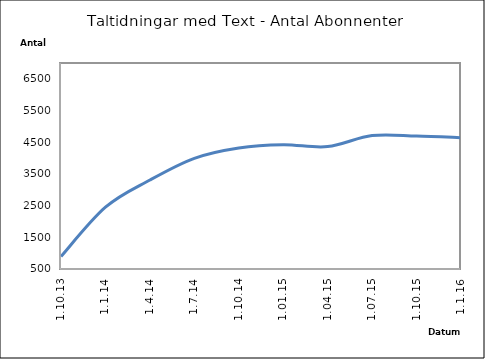
| Category | Series 0 |
|---|---|
| 1.10.13 | 894 |
| 1.1.14 | 2449 |
| 1.4.14 | 3307 |
| 1.7.14 | 3993 |
| 1.10.14 | 4320 |
| 1.01.15 | 4421 |
| 1.04.15 | 4362 |
| 1.07.15 | 4711 |
| 1.10.15 | 4696 |
| 1.1.16 | 4644 |